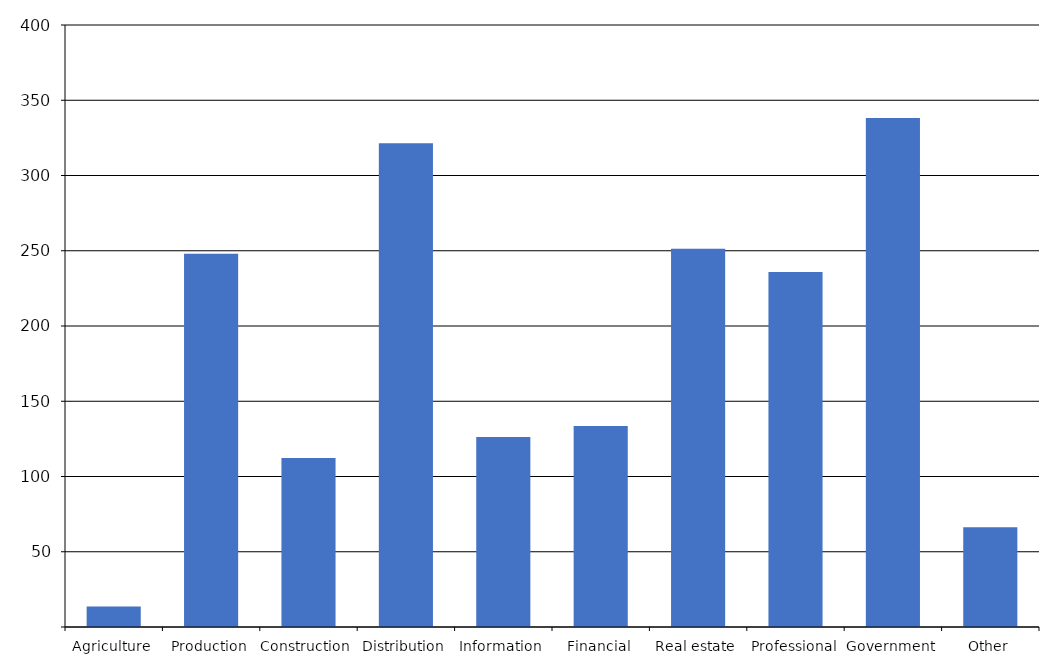
| Category | Series 0 |
|---|---|
| Agriculture | 13660 |
| Production | 247985 |
| Construction | 112234 |
| Distribution | 321350 |
| Information | 126288 |
| Financial | 133549 |
| Real estate | 251278 |
| Professional | 235881 |
| Government | 338132 |
| Other | 66337 |